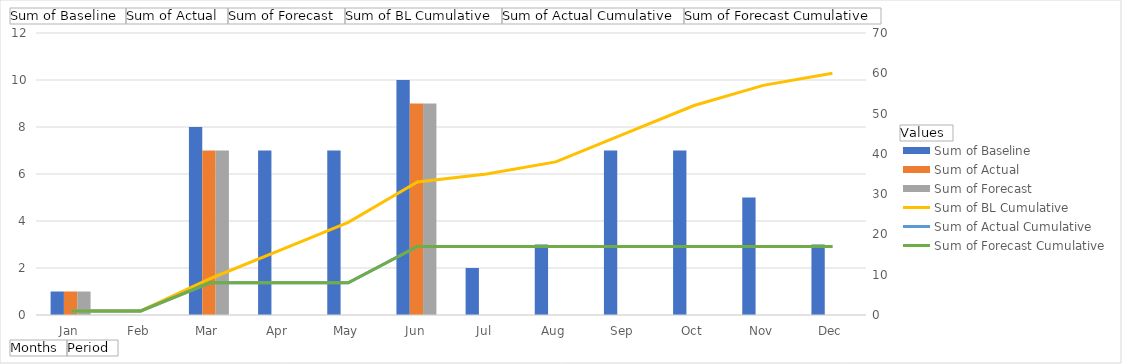
| Category | Sum of Baseline | Sum of Actual | Sum of Forecast |
|---|---|---|---|
| Jan | 1 | 1 | 1 |
| Feb | 0 | 0 | 0 |
| Mar | 8 | 7 | 7 |
| Apr | 7 | 0 | 0 |
| May | 7 | 0 | 0 |
| Jun | 10 | 9 | 9 |
| Jul | 2 | 0 | 0 |
| Aug | 3 | 0 | 0 |
| Sep | 7 | 0 | 0 |
| Oct | 7 | 0 | 0 |
| Nov | 5 | 0 | 0 |
| Dec | 3 | 0 | 0 |